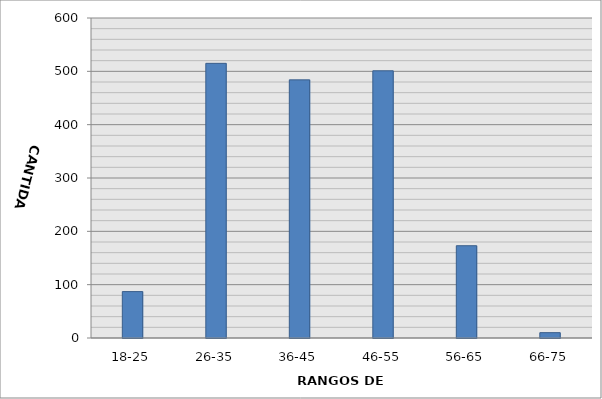
| Category | Series 0 |
|---|---|
| 18-25 | 87 |
| 26-35 | 515 |
| 36-45 | 484 |
| 46-55 | 501 |
| 56-65 | 173 |
| 66-75 | 10 |